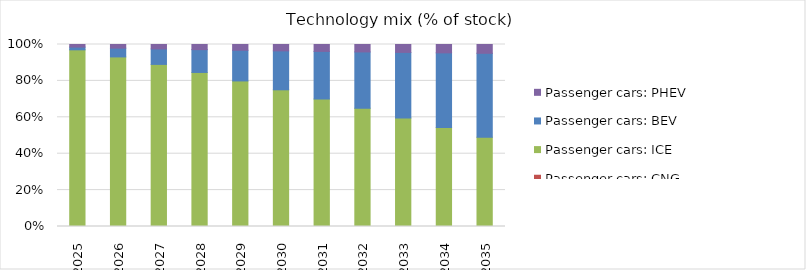
| Category | Passenger cars: CNG | Passenger cars: ICE | Passenger cars: BEV | Passenger cars: PHEV |
|---|---|---|---|---|
| 2025.0 | 0 | 0.97 | 0.015 | 0.014 |
| 2026.0 | 0 | 0.931 | 0.048 | 0.02 |
| 2027.0 | 0 | 0.89 | 0.085 | 0.024 |
| 2028.0 | 0 | 0.846 | 0.125 | 0.028 |
| 2029.0 | 0 | 0.8 | 0.168 | 0.032 |
| 2030.0 | 0 | 0.751 | 0.214 | 0.035 |
| 2031.0 | 0 | 0.7 | 0.261 | 0.038 |
| 2032.0 | 0 | 0.649 | 0.31 | 0.041 |
| 2033.0 | 0 | 0.597 | 0.36 | 0.043 |
| 2034.0 | 0 | 0.543 | 0.41 | 0.046 |
| 2035.0 | 0 | 0.49 | 0.462 | 0.048 |